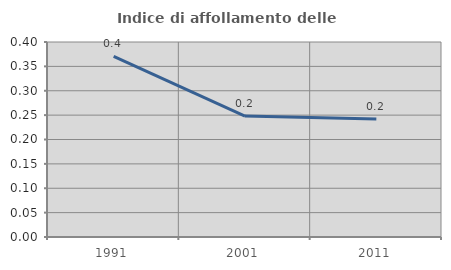
| Category | Indice di affollamento delle abitazioni  |
|---|---|
| 1991.0 | 0.371 |
| 2001.0 | 0.248 |
| 2011.0 | 0.242 |